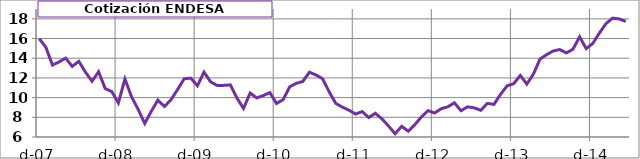
| Category | ENDESA |
|---|---|
| 2007-12-01 | 15.982 |
| 2008-01-01 | 15.11 |
| 2008-02-01 | 13.301 |
| 2008-03-01 | 13.63 |
| 2008-04-01 | 14.008 |
| 2008-05-01 | 13.173 |
| 2008-06-01 | 13.684 |
| 2008-07-01 | 12.599 |
| 2008-08-01 | 11.659 |
| 2008-09-01 | 12.628 |
| 2008-10-01 | 10.92 |
| 2008-11-01 | 10.612 |
| 2008-12-01 | 9.465 |
| 2009-01-01 | 11.888 |
| 2009-02-01 | 10.088 |
| 2009-03-01 | 8.812 |
| 2009-04-01 | 7.374 |
| 2009-05-01 | 8.61 |
| 2009-06-01 | 9.746 |
| 2009-07-01 | 9.094 |
| 2009-08-01 | 9.798 |
| 2009-09-01 | 10.834 |
| 2009-10-01 | 11.92 |
| 2009-11-01 | 11.976 |
| 2009-12-01 | 11.2 |
| 2010-01-01 | 12.594 |
| 2010-02-01 | 11.605 |
| 2010-03-01 | 11.226 |
| 2010-04-01 | 11.242 |
| 2010-05-01 | 11.292 |
| 2010-06-01 | 9.948 |
| 2010-07-01 | 8.904 |
| 2010-08-01 | 10.466 |
| 2010-09-01 | 9.972 |
| 2010-10-01 | 10.214 |
| 2010-11-01 | 10.503 |
| 2010-12-01 | 9.404 |
| 2011-01-01 | 9.785 |
| 2011-02-01 | 11.097 |
| 2011-03-01 | 11.45 |
| 2011-04-01 | 11.642 |
| 2011-05-01 | 12.583 |
| 2011-06-01 | 12.297 |
| 2011-07-01 | 11.913 |
| 2011-08-01 | 10.582 |
| 2011-09-01 | 9.409 |
| 2011-10-01 | 9.033 |
| 2011-11-01 | 8.72 |
| 2011-12-01 | 8.331 |
| 2012-01-01 | 8.583 |
| 2012-02-01 | 7.973 |
| 2012-03-01 | 8.41 |
| 2012-04-01 | 7.847 |
| 2012-05-01 | 7.119 |
| 2012-06-01 | 6.33 |
| 2012-07-01 | 7.084 |
| 2012-08-01 | 6.593 |
| 2012-09-01 | 7.258 |
| 2012-10-01 | 8.042 |
| 2012-11-01 | 8.678 |
| 2012-12-01 | 8.439 |
| 2013-01-01 | 8.873 |
| 2013-02-01 | 9.07 |
| 2013-03-01 | 9.47 |
| 2013-04-01 | 8.67 |
| 2013-05-01 | 9.065 |
| 2013-06-01 | 8.962 |
| 2013-07-01 | 8.71 |
| 2013-08-01 | 9.412 |
| 2013-09-01 | 9.312 |
| 2013-10-01 | 10.324 |
| 2013-11-01 | 11.192 |
| 2013-12-01 | 11.416 |
| 2014-01-01 | 12.254 |
| 2014-02-01 | 11.376 |
| 2014-03-01 | 12.397 |
| 2014-04-01 | 13.924 |
| 2014-05-01 | 14.366 |
| 2014-06-01 | 14.734 |
| 2014-07-01 | 14.882 |
| 2014-08-01 | 14.542 |
| 2014-09-01 | 14.918 |
| 2014-10-01 | 16.175 |
| 2014-11-01 | 14.98 |
| 2014-12-01 | 15.5 |
| 2015-01-01 | 16.55 |
| 2015-02-01 | 17.505 |
| 2015-03-01 | 18.07 |
| 2015-04-01 | 17.995 |
| 2015-05-01 | 17.735 |